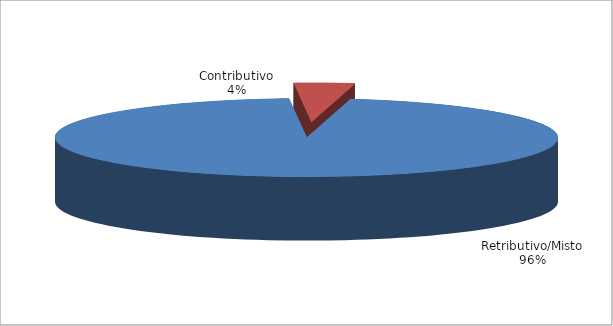
| Category | Series 1 |
|---|---|
| Retributivo/Misto | 27757 |
| Contributivo | 1125 |